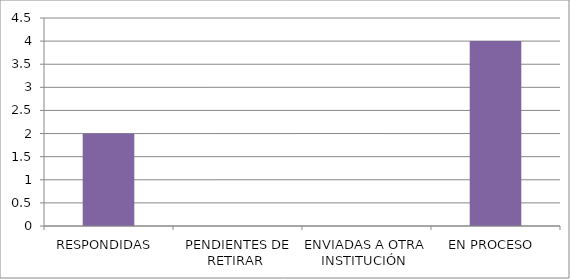
| Category | Series 0 |
|---|---|
| RESPONDIDAS  | 2 |
| PENDIENTES DE RETIRAR  | 0 |
| ENVIADAS A OTRA INSTITUCIÓN  | 0 |
| EN PROCESO  | 4 |